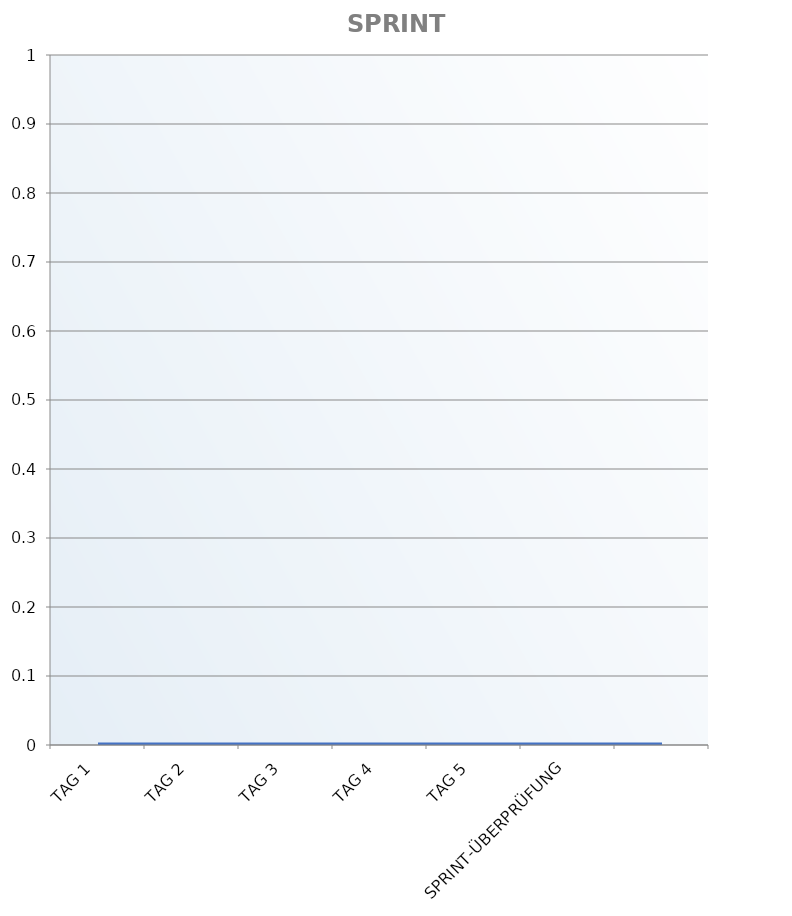
| Category | Sprint-Burndown-Diagramm |
|---|---|
| TAG 1 | 0 |
| TAG 2 | 0 |
| TAG 3 | 0 |
| TAG 4 | 0 |
| TAG 5 | 0 |
| SPRINT-ÜBERPRÜFUNG | 0 |